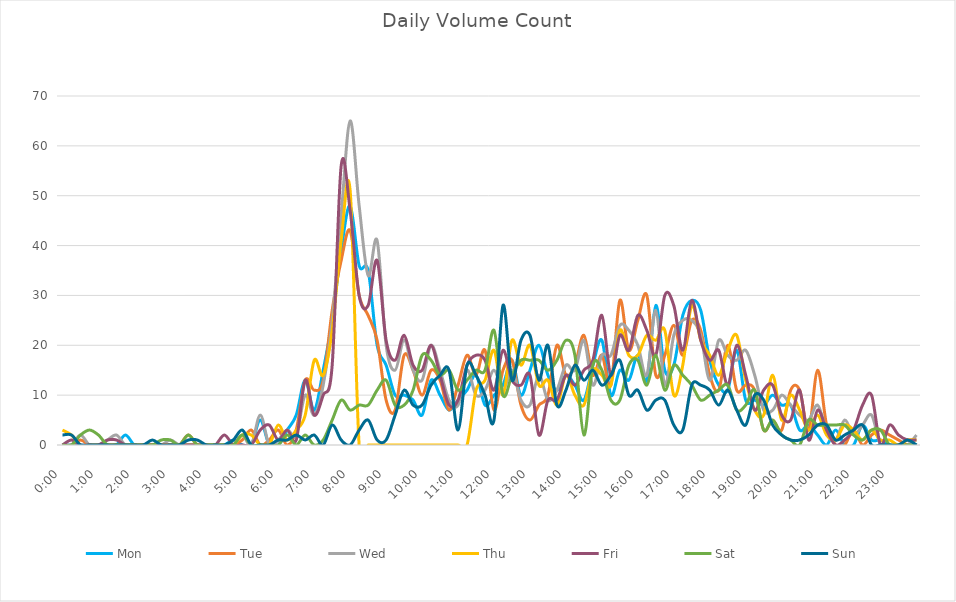
| Category | Mon | Tue | Wed | Thu | Fri | Sat | Sun |
|---|---|---|---|---|---|---|---|
| 0.0 | 0 | 0 | 0 | 3 | 0 | 0 | 2 |
| 0.010416666666666666 | 0 | 0 | 0 | 2 | 1 | 0 | 2 |
| 0.020833333333333332 | 0 | 1 | 2 | 0 | 0 | 2 | 0 |
| 0.03125 | 0 | 0 | 0 | 0 | 0 | 3 | 0 |
| 0.041666666666666664 | 0 | 0 | 0 | 0 | 0 | 2 | 0 |
| 0.05208333333333333 | 0 | 0 | 1 | 0 | 1 | 0 | 0 |
| 0.06249999999999999 | 0 | 0 | 2 | 0 | 1 | 0 | 0 |
| 0.07291666666666666 | 2 | 0 | 0 | 0 | 0 | 0 | 0 |
| 0.08333333333333333 | 0 | 0 | 0 | 0 | 0 | 0 | 0 |
| 0.09375 | 0 | 0 | 0 | 0 | 0 | 0 | 0 |
| 0.10416666666666667 | 0 | 0 | 0 | 0 | 0 | 0 | 1 |
| 0.11458333333333334 | 0 | 0 | 0 | 0 | 0 | 1 | 0 |
| 0.125 | 0 | 0 | 1 | 0 | 0 | 1 | 0 |
| 0.13541666666666666 | 0 | 0 | 0 | 0 | 0 | 0 | 0 |
| 0.14583333333333331 | 0 | 2 | 0 | 0 | 0 | 2 | 1 |
| 0.15624999999999997 | 0 | 0 | 0 | 0 | 0 | 0 | 1 |
| 0.16666666666666663 | 0 | 0 | 0 | 0 | 0 | 0 | 0 |
| 0.1770833333333333 | 0 | 0 | 0 | 0 | 0 | 0 | 0 |
| 0.18749999999999994 | 0 | 0 | 0 | 0 | 2 | 0 | 0 |
| 0.1979166666666666 | 1 | 0 | 0 | 0 | 0 | 0 | 1 |
| 0.20833333333333326 | 0 | 1 | 2 | 2 | 0 | 2 | 3 |
| 0.21874999999999992 | 0 | 3 | 0 | 2 | 0 | 0 | 0 |
| 0.22916666666666657 | 5 | 0 | 6 | 0 | 3 | 0 | 0 |
| 0.23958333333333323 | 0 | 1 | 0 | 0 | 4 | 0 | 0 |
| 0.2499999999999999 | 0 | 3 | 1 | 4 | 1 | 0 | 1 |
| 0.2604166666666666 | 3 | 0 | 3 | 1 | 3 | 2 | 1 |
| 0.27083333333333326 | 6 | 3 | 2 | 3 | 1 | 0 | 2 |
| 0.28124999999999994 | 13 | 13 | 10 | 6 | 13 | 2 | 1 |
| 0.29166666666666663 | 7 | 11 | 6 | 17 | 6 | 0 | 2 |
| 0.3020833333333333 | 15 | 13 | 12 | 14 | 10 | 1 | 0 |
| 0.3125 | 25 | 27 | 25 | 23 | 16 | 5 | 4 |
| 0.3229166666666667 | 39 | 37 | 46 | 41 | 56 | 9 | 1 |
| 0.33333333333333337 | 48 | 43 | 65 | 51 | 47 | 7 | 0 |
| 0.34375000000000006 | 36 | 30 | 48 | 0 | 30 | 8 | 3 |
| 0.35416666666666674 | 35 | 26 | 34 | 0 | 28 | 8 | 5 |
| 0.3645833333333334 | 20 | 21 | 41 | 0 | 37 | 11 | 1 |
| 0.3750000000000001 | 16 | 9 | 20 | 0 | 21 | 13 | 1 |
| 0.3854166666666668 | 10 | 7 | 15 | 0 | 17 | 8 | 6 |
| 0.3958333333333335 | 10 | 18 | 21 | 0 | 22 | 8 | 11 |
| 0.40625000000000017 | 9 | 15 | 15 | 0 | 16 | 11 | 8 |
| 0.41666666666666685 | 6 | 10 | 13 | 0 | 15 | 18 | 8 |
| 0.4270833333333333 | 13 | 15 | 20 | 0 | 20 | 17 | 12 |
| 0.4375000000000002 | 10 | 13 | 15 | 0 | 14 | 14 | 14 |
| 0.4479166666666669 | 7 | 7 | 9 | 0 | 8 | 15 | 15 |
| 0.4583333333333333 | 9 | 12 | 8 | 0 | 9 | 11 | 3 |
| 0.4687500000000003 | 11 | 18 | 15 | 0 | 16 | 13 | 16 |
| 0.47916666666666696 | 14 | 14 | 10 | 11 | 18 | 15 | 14 |
| 0.4895833333333333 | 8 | 19 | 11 | 13 | 17 | 15 | 10 |
| 0.5000000000000003 | 10 | 7 | 15 | 19 | 11 | 23 | 5 |
| 0.510416666666667 | 12 | 15 | 11 | 10 | 19 | 10 | 28 |
| 0.5208333333333334 | 17 | 17 | 15 | 21 | 13 | 14 | 13 |
| 0.5312500000000002 | 10 | 8 | 9 | 16 | 12 | 17 | 21 |
| 0.5416666666666669 | 15 | 5 | 8 | 20 | 14 | 17 | 22 |
| 0.5520833333333335 | 20 | 8 | 14 | 12 | 2 | 17 | 13 |
| 0.5625000000000001 | 14 | 10 | 9 | 13 | 9 | 15 | 20 |
| 0.5729166666666667 | 11 | 20 | 11 | 8 | 9 | 17 | 8 |
| 0.5833333333333334 | 14 | 14 | 16 | 14 | 14 | 21 | 11 |
| 0.59375 | 12 | 16 | 15 | 10 | 12 | 18 | 16 |
| 0.6041666666666666 | 9 | 22 | 21 | 8 | 15 | 2 | 13 |
| 0.6145833333333333 | 16 | 14 | 12 | 15 | 17 | 16 | 15 |
| 0.6249999999999999 | 21 | 18 | 18 | 14 | 26 | 15 | 12 |
| 0.6354166666666665 | 10 | 12 | 18 | 12 | 14 | 9 | 14 |
| 0.6458333333333331 | 15 | 29 | 24 | 23 | 22 | 9 | 17 |
| 0.6562499999999998 | 13 | 19 | 23 | 18 | 19 | 16 | 10 |
| 0.6666666666666666 | 18 | 25 | 20 | 18 | 26 | 17 | 11 |
| 0.677083333333333 | 13 | 30 | 14 | 22 | 23 | 12 | 7 |
| 0.6874999999999997 | 28 | 14 | 27 | 21 | 18 | 18 | 9 |
| 0.6979166666666666 | 15 | 18 | 12 | 23 | 30 | 11 | 9 |
| 0.7083333333333329 | 16 | 24 | 22 | 10 | 28 | 16 | 4 |
| 0.7187499999999996 | 26 | 18 | 25 | 16 | 19 | 14 | 3 |
| 0.7291666666666666 | 29 | 25 | 25 | 28 | 29 | 12 | 12 |
| 0.7395833333333328 | 27 | 23 | 22 | 21 | 21 | 9 | 12 |
| 0.75 | 17 | 14 | 13 | 18 | 17 | 10 | 11 |
| 0.7604166666666666 | 12 | 11 | 21 | 14 | 19 | 11 | 8 |
| 0.7708333333333327 | 11 | 20 | 18 | 19 | 12 | 12 | 11 |
| 0.78125 | 19 | 11 | 17 | 22 | 20 | 7 | 7 |
| 0.7916666666666666 | 9 | 12 | 19 | 13 | 14 | 8 | 4 |
| 0.8020833333333326 | 9 | 11 | 14 | 7 | 7 | 11 | 10 |
| 0.8125 | 8 | 3 | 7 | 6 | 11 | 3 | 9 |
| 0.8229166666666666 | 10 | 5 | 7 | 14 | 12 | 5 | 4 |
| 0.8333333333333334 | 8 | 3 | 10 | 5 | 6 | 2 | 2 |
| 0.84375 | 8 | 11 | 8 | 10 | 5 | 1 | 1 |
| 0.8541666666666666 | 3 | 11 | 6 | 7 | 11 | 0 | 1 |
| 0.8645833333333334 | 4 | 3 | 5 | 3 | 1 | 5 | 2 |
| 0.875 | 2 | 15 | 8 | 6 | 7 | 4 | 4 |
| 0.8854166666666666 | 0 | 4 | 3 | 2 | 3 | 4 | 4 |
| 0.8958333333333334 | 3 | 0 | 1 | 1 | 0 | 4 | 1 |
| 0.90625 | 0 | 0 | 5 | 4 | 1 | 4 | 2 |
| 0.9166666666666666 | 0 | 3 | 2 | 3 | 3 | 2 | 3 |
| 0.9270833333333334 | 4 | 0 | 4 | 1 | 8 | 1 | 4 |
| 0.9375 | 1 | 2 | 6 | 3 | 10 | 3 | 0 |
| 0.9479166666666666 | 1 | 3 | 0 | 1 | 0 | 3 | 0 |
| 0.9583333333333334 | 0 | 2 | 0 | 1 | 4 | 0 | 0 |
| 0.96875 | 0 | 1 | 0 | 0 | 2 | 0 | 0 |
| 0.9791666666666666 | 0 | 0 | 0 | 1 | 1 | 0 | 1 |
| 0.9895833333333334 | 0 | 0 | 2 | 1 | 1 | 0 | 0 |